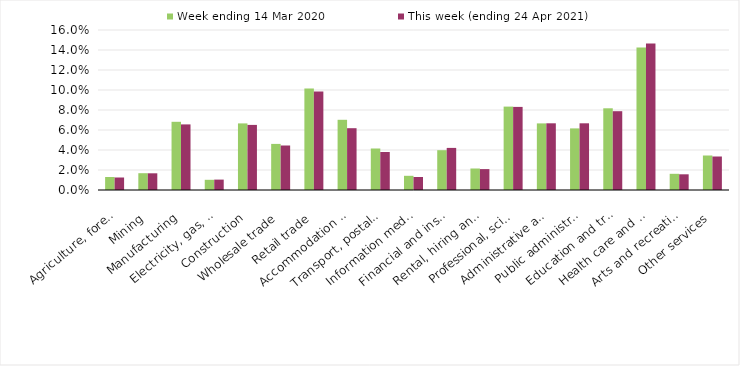
| Category | Week ending 14 Mar 2020 | This week (ending 24 Apr 2021) |
|---|---|---|
| Agriculture, forestry and fishing | 0.013 | 0.012 |
| Mining | 0.017 | 0.017 |
| Manufacturing | 0.068 | 0.066 |
| Electricity, gas, water and waste services | 0.01 | 0.01 |
| Construction | 0.067 | 0.065 |
| Wholesale trade | 0.046 | 0.044 |
| Retail trade | 0.102 | 0.098 |
| Accommodation and food services | 0.07 | 0.062 |
| Transport, postal and warehousing | 0.042 | 0.038 |
| Information media and telecommunications | 0.014 | 0.013 |
| Financial and insurance services | 0.04 | 0.042 |
| Rental, hiring and real estate services | 0.022 | 0.021 |
| Professional, scientific and technical services | 0.083 | 0.083 |
| Administrative and support services | 0.067 | 0.067 |
| Public administration and safety | 0.062 | 0.067 |
| Education and training | 0.082 | 0.079 |
| Health care and social assistance | 0.142 | 0.147 |
| Arts and recreation services | 0.016 | 0.016 |
| Other services | 0.034 | 0.034 |